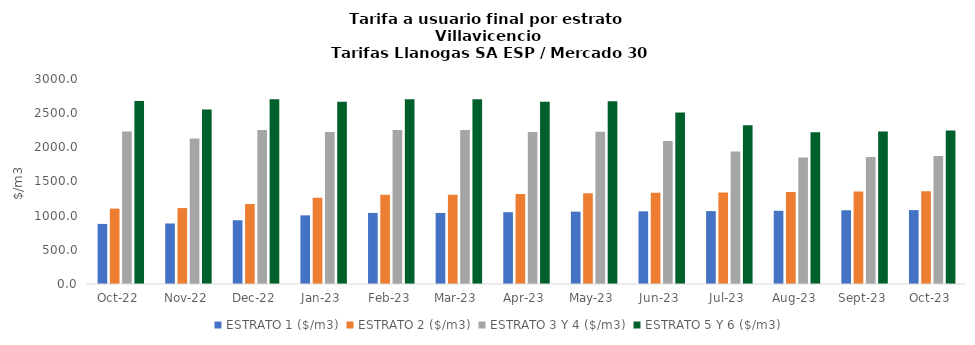
| Category | ESTRATO 1 ($/m3) | ESTRATO 2 ($/m3) | ESTRATO 3 Y 4 ($/m3) | ESTRATO 5 Y 6 ($/m3) |
|---|---|---|---|---|
| 2022-10-01 | 879.42 | 1103.3 | 2232.86 | 2679.432 |
| 2022-11-01 | 885.71 | 1111.19 | 2128.04 | 2553.648 |
| 2022-12-01 | 932.64 | 1170.28 | 2251.92 | 2702.304 |
| 2023-01-01 | 1004.76 | 1260.83 | 2223.64 | 2668.368 |
| 2023-02-01 | 1039.76 | 1304.76 | 2251.92 | 2702.304 |
| 2023-03-01 | 1039.76 | 1304.76 | 2251.92 | 2702.304 |
| 2023-04-01 | 1050.8 | 1318.62 | 2223.64 | 2668.368 |
| 2023-05-01 | 1058.67 | 1328.49 | 2227.49 | 2672.988 |
| 2023-06-01 | 1063.04 | 1333.97 | 2092.35 | 2510.82 |
| 2023-07-01 | 1066.3 | 1338.06 | 1937.39 | 2324.868 |
| 2023-08-01 | 1071.54 | 1344.64 | 1852.08 | 2222.496 |
| 2023-09-01 | 1079.09 | 1354.11 | 1858.9 | 2230.68 |
| 2023-10-01 | 1081.39 | 1357 | 1871.96 | 2246.352 |